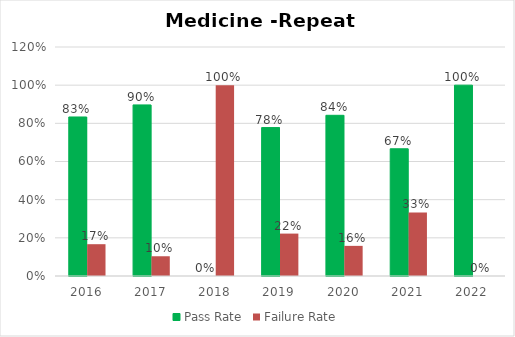
| Category | Pass Rate | Failure Rate |
|---|---|---|
| 2016.0 | 0.833 | 0.167 |
| 2017.0 | 0.897 | 0.103 |
| 2018.0 | 0 | 1 |
| 2019.0 | 0.778 | 0.222 |
| 2020.0 | 0.842 | 0.158 |
| 2021.0 | 0.667 | 0.333 |
| 2022.0 | 1 | 0 |